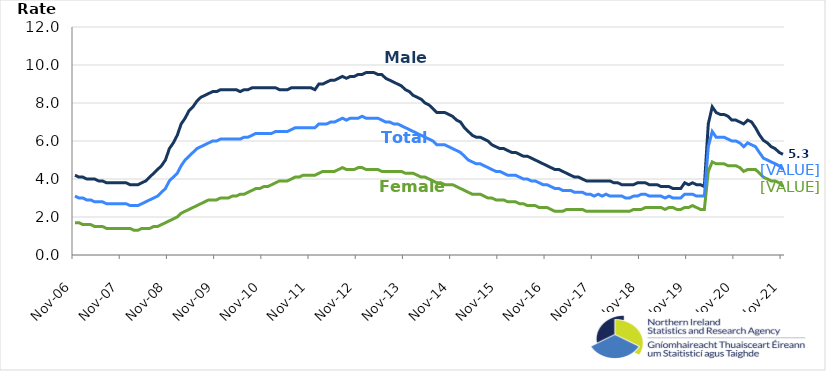
| Category | Male | Female | Total |
|---|---|---|---|
| 2006-11-01 | 4.2 | 1.7 | 3.1 |
| 2006-12-01 | 4.1 | 1.7 | 3 |
| 2007-01-01 | 4.1 | 1.6 | 3 |
| 2007-02-01 | 4 | 1.6 | 2.9 |
| 2007-03-01 | 4 | 1.6 | 2.9 |
| 2007-04-01 | 4 | 1.5 | 2.8 |
| 2007-05-01 | 3.9 | 1.5 | 2.8 |
| 2007-06-01 | 3.9 | 1.5 | 2.8 |
| 2007-07-01 | 3.8 | 1.4 | 2.7 |
| 2007-08-01 | 3.8 | 1.4 | 2.7 |
| 2007-09-01 | 3.8 | 1.4 | 2.7 |
| 2007-10-01 | 3.8 | 1.4 | 2.7 |
| 2007-11-01 | 3.8 | 1.4 | 2.7 |
| 2007-12-01 | 3.8 | 1.4 | 2.7 |
| 2008-01-01 | 3.7 | 1.4 | 2.6 |
| 2008-02-01 | 3.7 | 1.3 | 2.6 |
| 2008-03-01 | 3.7 | 1.3 | 2.6 |
| 2008-04-01 | 3.8 | 1.4 | 2.7 |
| 2008-05-01 | 3.9 | 1.4 | 2.8 |
| 2008-06-01 | 4.1 | 1.4 | 2.9 |
| 2008-07-01 | 4.3 | 1.5 | 3 |
| 2008-08-01 | 4.5 | 1.5 | 3.1 |
| 2008-09-01 | 4.7 | 1.6 | 3.3 |
| 2008-10-01 | 5 | 1.7 | 3.5 |
| 2008-11-01 | 5.6 | 1.8 | 3.9 |
| 2008-12-01 | 5.9 | 1.9 | 4.1 |
| 2009-01-01 | 6.3 | 2 | 4.3 |
| 2009-02-01 | 6.9 | 2.2 | 4.7 |
| 2009-03-01 | 7.2 | 2.3 | 5 |
| 2009-04-01 | 7.6 | 2.4 | 5.2 |
| 2009-05-01 | 7.8 | 2.5 | 5.4 |
| 2009-06-01 | 8.1 | 2.6 | 5.6 |
| 2009-07-01 | 8.3 | 2.7 | 5.7 |
| 2009-08-01 | 8.4 | 2.8 | 5.8 |
| 2009-09-01 | 8.5 | 2.9 | 5.9 |
| 2009-10-01 | 8.6 | 2.9 | 6 |
| 2009-11-01 | 8.6 | 2.9 | 6 |
| 2009-12-01 | 8.7 | 3 | 6.1 |
| 2010-01-01 | 8.7 | 3 | 6.1 |
| 2010-02-01 | 8.7 | 3 | 6.1 |
| 2010-03-01 | 8.7 | 3.1 | 6.1 |
| 2010-04-01 | 8.7 | 3.1 | 6.1 |
| 2010-05-01 | 8.6 | 3.2 | 6.1 |
| 2010-06-01 | 8.7 | 3.2 | 6.2 |
| 2010-07-01 | 8.7 | 3.3 | 6.2 |
| 2010-08-01 | 8.8 | 3.4 | 6.3 |
| 2010-09-01 | 8.8 | 3.5 | 6.4 |
| 2010-10-01 | 8.8 | 3.5 | 6.4 |
| 2010-11-01 | 8.8 | 3.6 | 6.4 |
| 2010-12-01 | 8.8 | 3.6 | 6.4 |
| 2011-01-01 | 8.8 | 3.7 | 6.4 |
| 2011-02-01 | 8.8 | 3.8 | 6.5 |
| 2011-03-01 | 8.7 | 3.9 | 6.5 |
| 2011-04-01 | 8.7 | 3.9 | 6.5 |
| 2011-05-01 | 8.7 | 3.9 | 6.5 |
| 2011-06-01 | 8.8 | 4 | 6.6 |
| 2011-07-01 | 8.8 | 4.1 | 6.7 |
| 2011-08-01 | 8.8 | 4.1 | 6.7 |
| 2011-09-01 | 8.8 | 4.2 | 6.7 |
| 2011-10-01 | 8.8 | 4.2 | 6.7 |
| 2011-11-01 | 8.8 | 4.2 | 6.7 |
| 2011-12-01 | 8.7 | 4.2 | 6.7 |
| 2012-01-01 | 9 | 4.3 | 6.9 |
| 2012-02-01 | 9 | 4.4 | 6.9 |
| 2012-03-01 | 9.1 | 4.4 | 6.9 |
| 2012-04-01 | 9.2 | 4.4 | 7 |
| 2012-05-01 | 9.2 | 4.4 | 7 |
| 2012-06-01 | 9.3 | 4.5 | 7.1 |
| 2012-07-01 | 9.4 | 4.6 | 7.2 |
| 2012-08-01 | 9.3 | 4.5 | 7.1 |
| 2012-09-01 | 9.4 | 4.5 | 7.2 |
| 2012-10-01 | 9.4 | 4.5 | 7.2 |
| 2012-11-01 | 9.5 | 4.6 | 7.2 |
| 2012-12-01 | 9.5 | 4.6 | 7.3 |
| 2013-01-01 | 9.6 | 4.5 | 7.2 |
| 2013-02-01 | 9.6 | 4.5 | 7.2 |
| 2013-03-01 | 9.6 | 4.5 | 7.2 |
| 2013-04-01 | 9.5 | 4.5 | 7.2 |
| 2013-05-01 | 9.5 | 4.4 | 7.1 |
| 2013-06-01 | 9.3 | 4.4 | 7 |
| 2013-07-01 | 9.2 | 4.4 | 7 |
| 2013-08-01 | 9.1 | 4.4 | 6.9 |
| 2013-09-01 | 9 | 4.4 | 6.9 |
| 2013-10-01 | 8.9 | 4.4 | 6.8 |
| 2013-11-01 | 8.7 | 4.3 | 6.7 |
| 2013-12-01 | 8.6 | 4.3 | 6.6 |
| 2014-01-01 | 8.4 | 4.3 | 6.5 |
| 2014-02-01 | 8.3 | 4.2 | 6.4 |
| 2014-03-01 | 8.2 | 4.1 | 6.3 |
| 2014-04-01 | 8 | 4.1 | 6.2 |
| 2014-05-01 | 7.9 | 4 | 6.1 |
| 2014-06-01 | 7.7 | 3.9 | 6 |
| 2014-07-01 | 7.5 | 3.8 | 5.8 |
| 2014-08-01 | 7.5 | 3.8 | 5.8 |
| 2014-09-01 | 7.5 | 3.7 | 5.8 |
| 2014-10-01 | 7.4 | 3.7 | 5.7 |
| 2014-11-01 | 7.3 | 3.7 | 5.6 |
| 2014-12-01 | 7.1 | 3.6 | 5.5 |
| 2015-01-01 | 7 | 3.5 | 5.4 |
| 2015-02-01 | 6.7 | 3.4 | 5.2 |
| 2015-03-01 | 6.5 | 3.3 | 5 |
| 2015-04-01 | 6.3 | 3.2 | 4.9 |
| 2015-05-01 | 6.2 | 3.2 | 4.8 |
| 2015-06-01 | 6.2 | 3.2 | 4.8 |
| 2015-07-01 | 6.1 | 3.1 | 4.7 |
| 2015-08-01 | 6 | 3 | 4.6 |
| 2015-09-01 | 5.8 | 3 | 4.5 |
| 2015-10-01 | 5.7 | 2.9 | 4.4 |
| 2015-11-01 | 5.6 | 2.9 | 4.4 |
| 2015-12-01 | 5.6 | 2.9 | 4.3 |
| 2016-01-01 | 5.5 | 2.8 | 4.2 |
| 2016-02-01 | 5.4 | 2.8 | 4.2 |
| 2016-03-01 | 5.4 | 2.8 | 4.2 |
| 2016-04-01 | 5.3 | 2.7 | 4.1 |
| 2016-05-01 | 5.2 | 2.7 | 4 |
| 2016-06-01 | 5.2 | 2.6 | 4 |
| 2016-07-01 | 5.1 | 2.6 | 3.9 |
| 2016-08-01 | 5 | 2.6 | 3.9 |
| 2016-09-01 | 4.9 | 2.5 | 3.8 |
| 2016-10-01 | 4.8 | 2.5 | 3.7 |
| 2016-11-01 | 4.7 | 2.5 | 3.7 |
| 2016-12-01 | 4.6 | 2.4 | 3.6 |
| 2017-01-01 | 4.5 | 2.3 | 3.5 |
| 2017-02-01 | 4.5 | 2.3 | 3.5 |
| 2017-03-01 | 4.4 | 2.3 | 3.4 |
| 2017-04-01 | 4.3 | 2.4 | 3.4 |
| 2017-05-01 | 4.2 | 2.4 | 3.4 |
| 2017-06-01 | 4.1 | 2.4 | 3.3 |
| 2017-07-01 | 4.1 | 2.4 | 3.3 |
| 2017-08-01 | 4 | 2.4 | 3.3 |
| 2017-09-01 | 3.9 | 2.3 | 3.2 |
| 2017-10-01 | 3.9 | 2.3 | 3.2 |
| 2017-11-01 | 3.9 | 2.3 | 3.1 |
| 2017-12-01 | 3.9 | 2.3 | 3.2 |
| 2018-01-01 | 3.9 | 2.3 | 3.1 |
| 2018-02-01 | 3.9 | 2.3 | 3.2 |
| 2018-03-01 | 3.9 | 2.3 | 3.1 |
| 2018-04-01 | 3.8 | 2.3 | 3.1 |
| 2018-05-01 | 3.8 | 2.3 | 3.1 |
| 2018-06-01 | 3.7 | 2.3 | 3.1 |
| 2018-07-01 | 3.7 | 2.3 | 3 |
| 2018-08-01 | 3.7 | 2.3 | 3 |
| 2018-09-01 | 3.7 | 2.4 | 3.1 |
| 2018-10-01 | 3.8 | 2.4 | 3.1 |
| 2018-11-01 | 3.8 | 2.4 | 3.2 |
| 2018-12-01 | 3.8 | 2.5 | 3.2 |
| 2019-01-01 | 3.7 | 2.5 | 3.1 |
| 2019-02-01 | 3.7 | 2.5 | 3.1 |
| 2019-03-01 | 3.7 | 2.5 | 3.1 |
| 2019-04-01 | 3.6 | 2.5 | 3.1 |
| 2019-05-01 | 3.6 | 2.4 | 3 |
| 2019-06-01 | 3.6 | 2.5 | 3.1 |
| 2019-07-01 | 3.5 | 2.5 | 3 |
| 2019-08-01 | 3.5 | 2.4 | 3 |
| 2019-09-01 | 3.5 | 2.4 | 3 |
| 2019-10-01 | 3.8 | 2.5 | 3.2 |
| 2019-11-01 | 3.7 | 2.5 | 3.2 |
| 2019-12-01 | 3.8 | 2.6 | 3.2 |
| 2020-01-01 | 3.7 | 2.5 | 3.1 |
| 2020-02-01 | 3.7 | 2.4 | 3.1 |
| 2020-03-01 | 3.6 | 2.4 | 3.1 |
| 2020-04-01 | 6.9 | 4.4 | 5.7 |
| 2020-05-01 | 7.8 | 4.9 | 6.5 |
| 2020-06-01 | 7.5 | 4.8 | 6.2 |
| 2020-07-01 | 7.4 | 4.8 | 6.2 |
| 2020-08-01 | 7.4 | 4.8 | 6.2 |
| 2020-09-01 | 7.3 | 4.7 | 6.1 |
| 2020-10-01 | 7.1 | 4.7 | 6 |
| 2020-11-01 | 7.1 | 4.7 | 6 |
| 2020-12-01 | 7 | 4.6 | 5.9 |
| 2021-01-01 | 6.9 | 4.4 | 5.7 |
| 2021-02-01 | 7.1 | 4.5 | 5.9 |
| 2021-03-01 | 7 | 4.5 | 5.8 |
| 2021-04-01 | 6.7 | 4.5 | 5.7 |
| 2021-05-01 | 6.326 | 4.311 | 5.393 |
| 2021-06-01 | 6.036 | 4.1 | 5.1 |
| 2021-07-01 | 5.9 | 4 | 5 |
| 2021-08-01 | 5.7 | 3.9 | 4.9 |
| 2021-09-01 | 5.6 | 3.9 | 4.8 |
| 2021-10-01 | 5.4 | 3.8 | 4.7 |
| 2021-11-01 | 5.3 | 3.6 | 4.5 |